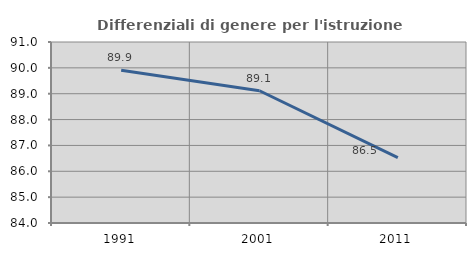
| Category | Differenziali di genere per l'istruzione superiore |
|---|---|
| 1991.0 | 89.904 |
| 2001.0 | 89.114 |
| 2011.0 | 86.528 |